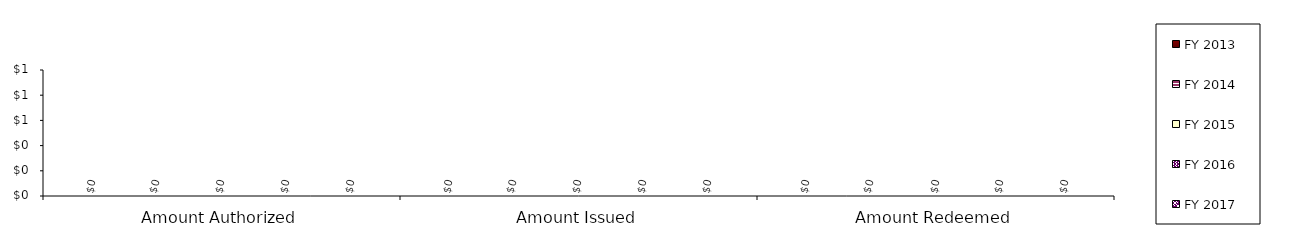
| Category | FY 2013 | FY 2014 | FY 2015 | FY 2016 | FY 2017 |
|---|---|---|---|---|---|
| Amount Authorized | 0 | 0 | 0 | 0 | 0 |
| Amount Issued | 0 | 0 | 0 | 0 | 0 |
| Amount Redeemed | 0 | 0 | 0 | 0 | 0 |